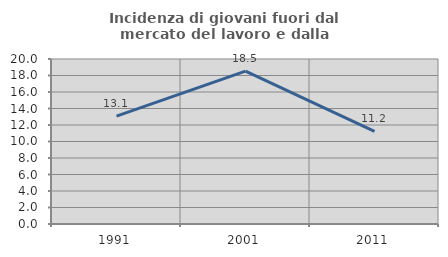
| Category | Incidenza di giovani fuori dal mercato del lavoro e dalla formazione  |
|---|---|
| 1991.0 | 13.081 |
| 2001.0 | 18.536 |
| 2011.0 | 11.23 |